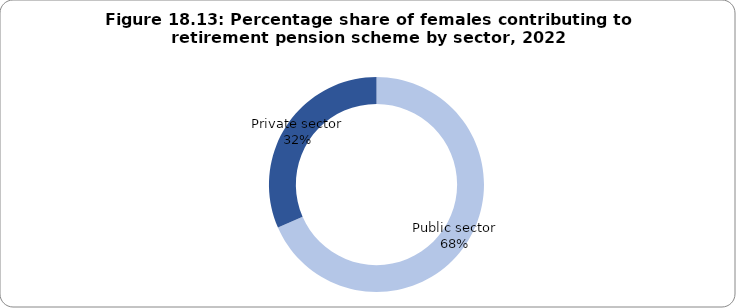
| Category | Series 0 |
|---|---|
| Public sector | 52.033 |
| Private sector | 23.97 |